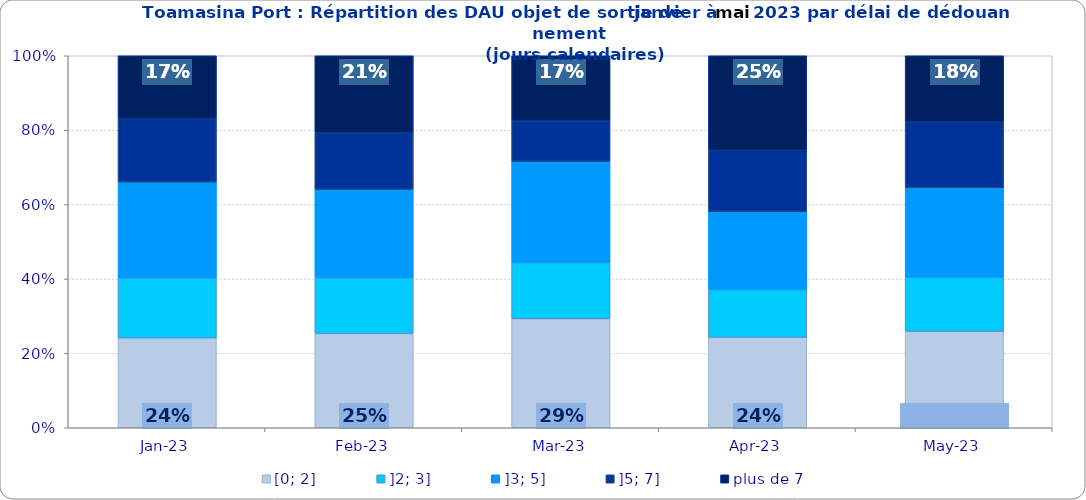
| Category | [0; 2] | ]2; 3] | ]3; 5] | ]5; 7] | plus de 7 |
|---|---|---|---|---|---|
| 2023-01-01 | 0.242 | 0.161 | 0.258 | 0.171 | 0.169 |
| 2023-02-01 | 0.253 | 0.15 | 0.238 | 0.152 | 0.207 |
| 2023-03-01 | 0.293 | 0.151 | 0.272 | 0.109 | 0.175 |
| 2023-04-01 | 0.243 | 0.129 | 0.209 | 0.165 | 0.254 |
| 2023-05-01 | 0.259 | 0.146 | 0.24 | 0.178 | 0.177 |